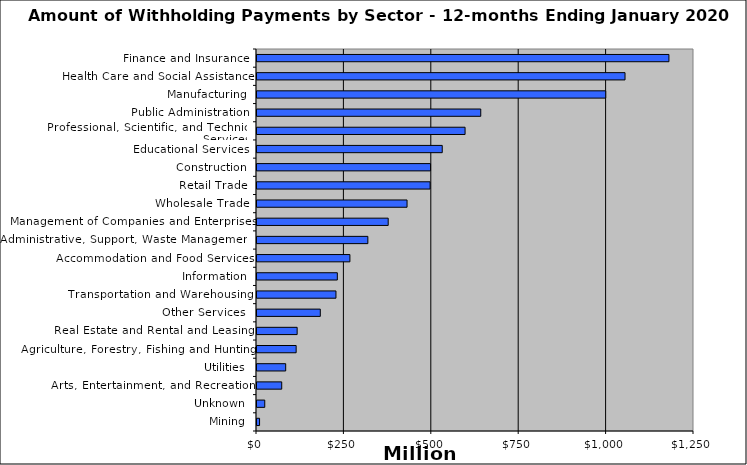
| Category | Payment |
|---|---|
| Mining | 7368000 |
| Unknown | 22177000 |
| Arts, Entertainment, and Recreation | 70723000 |
| Utilities | 82059000 |
| Agriculture, Forestry, Fishing and Hunting | 111983000 |
| Real Estate and Rental and Leasing | 114862000 |
| Other Services  | 181077000 |
| Transportation and Warehousing | 225871000 |
| Information | 229809000 |
| Accommodation and Food Services | 265753000 |
| Administrative, Support, Waste Management, | 317074000 |
| Management of Companies and Enterprises | 375274000 |
| Wholesale Trade | 429209000 |
| Retail Trade | 495127000 |
| Construction | 496430000 |
| Educational Services | 529877000 |
| Professional, Scientific, and Technical Services | 595179000 |
| Public Administration | 640049000 |
| Manufacturing | 997533000 |
| Health Care and Social Assistance | 1052687000 |
| Finance and Insurance | 1178274000 |